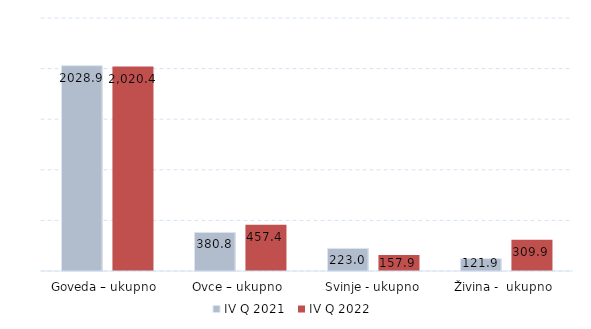
| Category | IV Q 2021 | IV Q 2022 |
|---|---|---|
| Goveda – ukupno  | 2028.923 | 2020.4 |
| Ovce – ukupno  | 380.8 | 457.4 |
| Svinje - ukupno | 222.985 | 157.9 |
| Živina -  ukupno  | 121.9 | 309.9 |